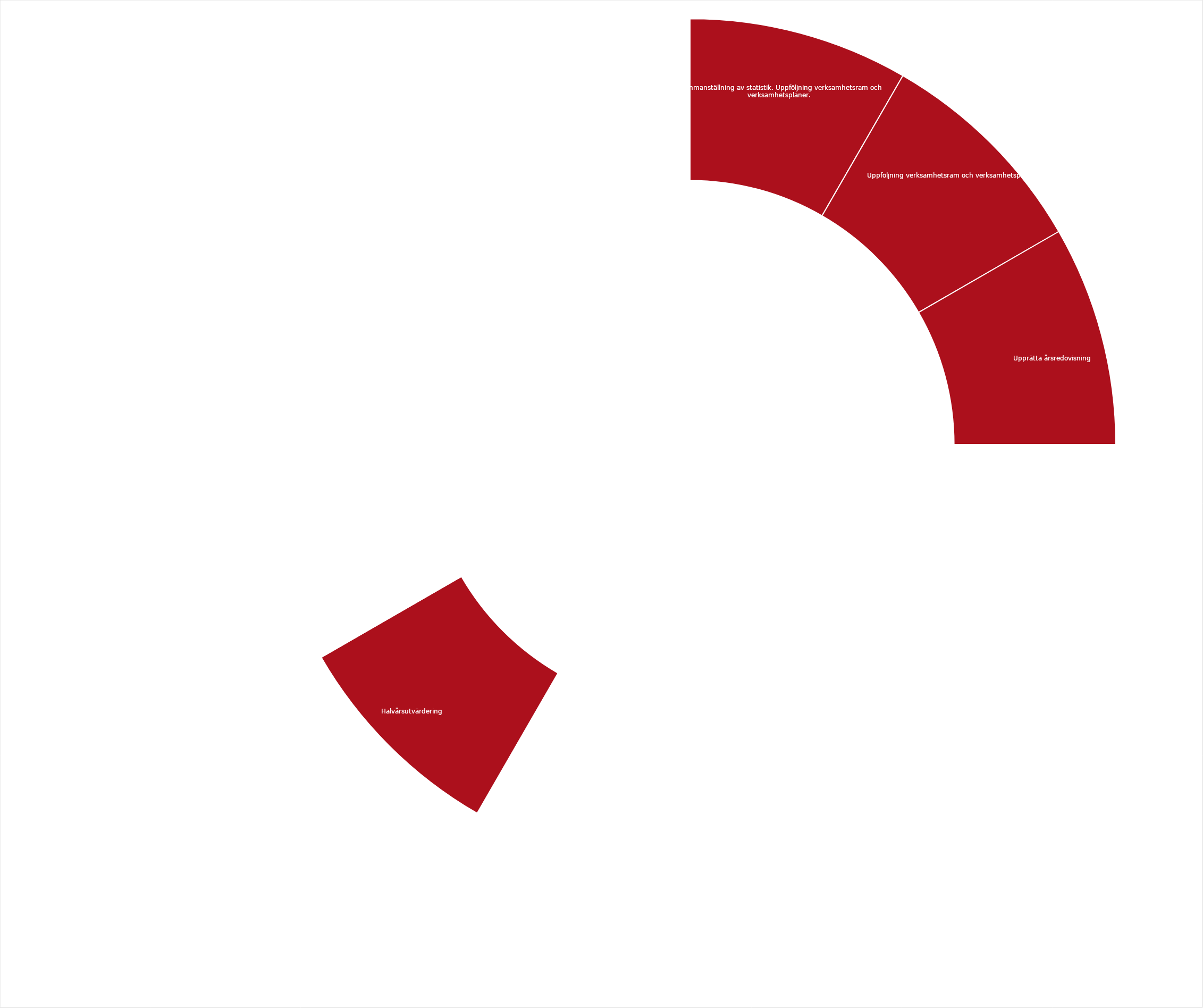
| Category | Series 0 |
|---|---|
| Sammanställning av statistik. Uppföljning verksamhetsram och verksamhetsplaner.  | 1 |
| Uppföljning verksamhetsram och verksamhetsplaner.  | 1 |
| Upprätta årsredovisning | 1 |
|  | 1 |
|  | 1 |
|  | 1 |
|  | 1 |
| Halvårsutvärdering | 1 |